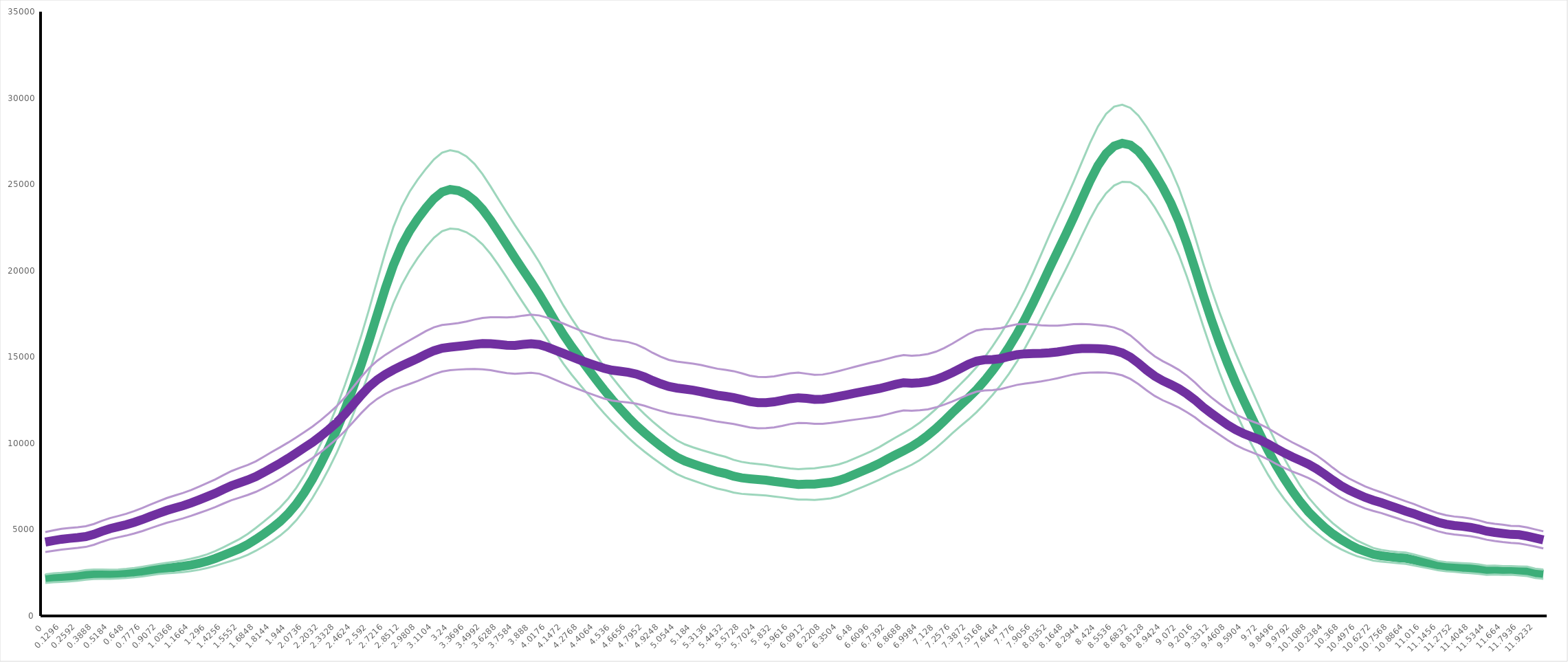
| Category | Series 0 | Series 2 | Series 3 | Series 4 | Series 6 | Series 7 |
|---|---|---|---|---|---|---|
| 0.0 | 2163.049 | 2411.605 | 1914.492 | 4280.385 | 4854.576 | 3706.194 |
| 0.0648 | 2210.368 | 2466.346 | 1954.389 | 4366.915 | 4958.204 | 3775.625 |
| 0.1296 | 2234.964 | 2495.438 | 1974.489 | 4442.118 | 5044.809 | 3839.427 |
| 0.1944 | 2271.876 | 2540.512 | 2003.239 | 4495.712 | 5099.495 | 3891.93 |
| 0.2592 | 2311.555 | 2583.061 | 2040.049 | 4538.245 | 5138.885 | 3937.605 |
| 0.324 | 2380.615 | 2657.579 | 2103.651 | 4596.774 | 5195.303 | 3998.246 |
| 0.3888 | 2412.805 | 2686.272 | 2139.338 | 4725.043 | 5326.624 | 4123.462 |
| 0.4536 | 2416.165 | 2683.911 | 2148.419 | 4899.577 | 5507.258 | 4291.895 |
| 0.5184 | 2414.963 | 2675.928 | 2153.998 | 5055.484 | 5667.34 | 4443.628 |
| 0.5832 | 2433.409 | 2691.871 | 2174.948 | 5172.232 | 5790.133 | 4554.331 |
| 0.648 | 2462.988 | 2724.174 | 2201.802 | 5286.346 | 5917.361 | 4655.332 |
| 0.7128 | 2507.661 | 2776.061 | 2239.261 | 5427.194 | 6077.427 | 4776.961 |
| 0.7776 | 2570.959 | 2848.75 | 2293.169 | 5586.823 | 6255.597 | 4918.049 |
| 0.8424 | 2647.4 | 2931.993 | 2362.808 | 5767.642 | 6451.744 | 5083.54 |
| 0.9072 | 2716.969 | 3008.909 | 2425.029 | 5941.809 | 6641.662 | 5241.957 |
| 0.972 | 2768.302 | 3072.198 | 2464.406 | 6110.945 | 6828.538 | 5393.351 |
| 1.0368 | 2816.168 | 3136.855 | 2495.481 | 6249.301 | 6979.667 | 5518.934 |
| 1.1016 | 2879.341 | 3220.059 | 2538.623 | 6385.121 | 7122.888 | 5647.353 |
| 1.1664 | 2953.573 | 3312.702 | 2594.444 | 6542.815 | 7289.434 | 5796.195 |
| 1.2312 | 3048.989 | 3424.675 | 2673.304 | 6725.379 | 7488.483 | 5962.274 |
| 1.296 | 3172.732 | 3570.345 | 2775.119 | 6912.484 | 7694.987 | 6129.982 |
| 1.3608 | 3330.127 | 3757.984 | 2902.27 | 7105.821 | 7907.648 | 6303.994 |
| 1.4256 | 3514.855 | 3980.293 | 3049.418 | 7333.957 | 8157.909 | 6510.006 |
| 1.4904 | 3704.852 | 4212.561 | 3197.144 | 7546.764 | 8391.935 | 6701.593 |
| 1.5552 | 3901.434 | 4456.089 | 3346.779 | 7714.232 | 8573.022 | 6855.442 |
| 1.62 | 4143.45 | 4749.929 | 3536.971 | 7877.915 | 8746.649 | 7009.181 |
| 1.6848 | 4434.763 | 5095.059 | 3774.466 | 8071.188 | 8955.317 | 7187.059 |
| 1.7496 | 4753.449 | 5466.676 | 4040.222 | 8317.658 | 9226.107 | 7409.209 |
| 1.8144 | 5092.135 | 5856.705 | 4327.564 | 8579.633 | 9503.217 | 7656.049 |
| 1.8792 | 5471.406 | 6288.078 | 4654.735 | 8846.768 | 9770.023 | 7923.512 |
| 1.944 | 5926.17 | 6801.175 | 5051.164 | 9132.853 | 10047.648 | 8218.058 |
| 2.0088 | 6480.809 | 7421.252 | 5540.366 | 9435 | 10342.249 | 8527.752 |
| 2.0736 | 7150.926 | 8164.86 | 6136.991 | 9747.214 | 10652.746 | 8841.683 |
| 2.1384 | 7926.611 | 9016.163 | 6837.06 | 10059.683 | 10970.944 | 9148.421 |
| 2.2032 | 8795.15 | 9957.531 | 7632.769 | 10410.261 | 11332.06 | 9488.463 |
| 2.268 | 9748.047 | 10985.188 | 8510.906 | 10794.433 | 11728.959 | 9859.908 |
| 2.3328 | 10791.009 | 12116.926 | 9465.091 | 11204.243 | 12155.226 | 10253.26 |
| 2.3976 | 11944.743 | 13374.591 | 10514.894 | 11687.595 | 12663.795 | 10711.394 |
| 2.4624 | 13199.251 | 14745.482 | 11653.021 | 12231.073 | 13240.494 | 11221.652 |
| 2.5272 | 14527.638 | 16202.603 | 12852.674 | 12784.109 | 13827.855 | 11740.363 |
| 2.592 | 15961.992 | 17782.621 | 14141.363 | 13283.963 | 14360.296 | 12207.63 |
| 2.6568 | 17475.713 | 19445.293 | 15506.133 | 13681.137 | 14785.823 | 12576.452 |
| 2.7216 | 18978.344 | 21084.338 | 16872.35 | 13992.622 | 15124.762 | 12860.481 |
| 2.7864 | 20333.958 | 22542.591 | 18125.326 | 14255.72 | 15420.201 | 13091.24 |
| 2.8512 | 21433.898 | 23697.661 | 19170.134 | 14487.46 | 15696.982 | 13277.938 |
| 2.916 | 22299.573 | 24577.721 | 20021.425 | 14703.159 | 15966.747 | 13439.571 |
| 2.9808 | 23005.946 | 25275.741 | 20736.151 | 14920.138 | 16231.165 | 13609.111 |
| 3.0456 | 23630.627 | 25893.906 | 21367.347 | 15153.188 | 16499.099 | 13807.277 |
| 3.1104 | 24175.618 | 26443.17 | 21908.067 | 15363.121 | 16721.673 | 14004.569 |
| 3.1752 | 24559.175 | 26832.738 | 22285.611 | 15503.928 | 16853.981 | 14153.876 |
| 3.24 | 24705.561 | 26972.116 | 22439.007 | 15567.962 | 16905.528 | 14230.397 |
| 3.3048 | 24638.962 | 26880.029 | 22397.895 | 15614.911 | 16960.094 | 14269.728 |
| 3.3696 | 24424.913 | 26622.241 | 22227.586 | 15671.065 | 17050.791 | 14291.339 |
| 3.4344 | 24061.801 | 26188.048 | 21935.555 | 15733.116 | 17166.156 | 14300.075 |
| 3.4992 | 23551.867 | 25587.892 | 21515.843 | 15774.425 | 17263.958 | 14284.893 |
| 3.564 | 22917.422 | 24871.787 | 20963.057 | 15767.692 | 17303.702 | 14231.683 |
| 3.6288 | 22207.336 | 24111.118 | 20303.554 | 15724.659 | 17301.692 | 14147.627 |
| 3.6936 | 21479.618 | 23365.607 | 19593.629 | 15680.408 | 17295.385 | 14065.432 |
| 3.7584 | 20745.283 | 22632.728 | 18857.839 | 15670.804 | 17319.19 | 14022.418 |
| 3.8232 | 20039.483 | 21935.798 | 18143.169 | 15725.04 | 17394.853 | 14055.226 |
| 3.888 | 19342.224 | 21235.842 | 17448.607 | 15766.592 | 17445.102 | 14088.083 |
| 3.9528 | 18624.875 | 20495.123 | 16754.628 | 15718.605 | 17405.955 | 14031.255 |
| 4.0176 | 17848.719 | 19668.633 | 16028.805 | 15574.947 | 17276.873 | 13873.022 |
| 4.0824 | 17045.588 | 18799.19 | 15291.986 | 15388.708 | 17106.987 | 13670.428 |
| 4.1472 | 16286.369 | 17972.103 | 14600.634 | 15203.655 | 16931.877 | 13475.433 |
| 4.212 | 15601.355 | 17225.576 | 13977.133 | 15010.499 | 16737.056 | 13283.942 |
| 4.2768 | 14970.561 | 16529.85 | 13411.273 | 14824.526 | 16547.976 | 13101.077 |
| 4.3416 | 14332.551 | 15820.143 | 12844.959 | 14659.542 | 16390.922 | 12928.163 |
| 4.4064 | 13701.338 | 15117.108 | 12285.567 | 14496.887 | 16238.762 | 12755.012 |
| 4.4712 | 13099.054 | 14449.641 | 11748.468 | 14343.703 | 16095.064 | 12592.341 |
| 4.536 | 12533.755 | 13825.822 | 11241.688 | 14232.963 | 15991.572 | 12474.353 |
| 4.6008 | 12007.089 | 13240.665 | 10773.512 | 14174.779 | 15937.024 | 12412.533 |
| 4.6656 | 11497.014 | 12674.19 | 10319.838 | 14112.124 | 15861.736 | 12362.513 |
| 4.7304 | 11029.007 | 12155.083 | 9902.931 | 14007.939 | 15725.344 | 12290.535 |
| 4.7952 | 10603.938 | 11690.185 | 9517.691 | 13841.484 | 15508.464 | 12174.503 |
| 4.86 | 10210.656 | 11265.542 | 9155.77 | 13631.819 | 15242.223 | 12021.415 |
| 4.9248 | 9844.019 | 10870.953 | 8817.085 | 13446.537 | 15013.738 | 11879.336 |
| 4.9896 | 9496.176 | 10495.55 | 8496.802 | 13295.126 | 14834.237 | 11756.015 |
| 5.0544 | 9195.205 | 10170.506 | 8219.904 | 13200.17 | 14731.504 | 11668.837 |
| 5.1192 | 8970.856 | 9934.22 | 8007.493 | 13138.281 | 14674.033 | 11602.529 |
| 5.184 | 8803.428 | 9764.166 | 7842.69 | 13072.795 | 14615.167 | 11530.424 |
| 5.2488 | 8646.407 | 9613.963 | 7678.851 | 12987.433 | 14529.862 | 11445.004 |
| 5.3136 | 8499.861 | 9476.778 | 7522.943 | 12885.075 | 14421.474 | 11348.676 |
| 5.3784 | 8356.433 | 9335.884 | 7376.982 | 12787.21 | 14320.072 | 11254.349 |
| 5.4432 | 8248.673 | 9218.43 | 7278.916 | 12719.989 | 14253.134 | 11186.845 |
| 5.508 | 8094.771 | 9044.225 | 7145.318 | 12649.26 | 14179.056 | 11119.464 |
| 5.5728 | 7998.02 | 8923.306 | 7072.735 | 12537.506 | 14054.641 | 11020.371 |
| 5.6376 | 7945.802 | 8853.921 | 7037.682 | 12418.985 | 13919.09 | 10918.88 |
| 5.7024 | 7901.874 | 8799.232 | 7004.516 | 12358.171 | 13845.106 | 10871.237 |
| 5.7672 | 7864.072 | 8751.285 | 6976.86 | 12355.406 | 13833.848 | 10876.965 |
| 5.832 | 7792.804 | 8670.142 | 6915.466 | 12400.534 | 13877.148 | 10923.921 |
| 5.8968 | 7733.064 | 8602.596 | 6863.531 | 12490.227 | 13967.428 | 11013.025 |
| 5.9616 | 7669.196 | 8539.549 | 6798.844 | 12584.114 | 14054.565 | 11113.662 |
| 6.0264 | 7620.285 | 8499.098 | 6741.472 | 12636.081 | 14090.586 | 11181.576 |
| 6.0912 | 7636.737 | 8533.166 | 6740.309 | 12598.726 | 14030.618 | 11166.834 |
| 6.156 | 7635.623 | 8551.293 | 6719.953 | 12546.293 | 13967.161 | 11125.425 |
| 6.2208 | 7691.724 | 8623.56 | 6759.888 | 12553.897 | 13981.108 | 11126.687 |
| 6.2856 | 7745.482 | 8681.356 | 6809.607 | 12624.408 | 14071.503 | 11177.314 |
| 6.3504 | 7850.002 | 8779.364 | 6920.639 | 12714.224 | 14186.882 | 11241.567 |
| 6.4152 | 8011.611 | 8933.53 | 7089.692 | 12808.251 | 14308.177 | 11308.325 |
| 6.48 | 8211.9 | 9133.989 | 7289.812 | 12903.484 | 14433.406 | 11373.562 |
| 6.5448 | 8408.151 | 9332.711 | 7483.591 | 12993.873 | 14554.761 | 11432.984 |
| 6.6096 | 8611.837 | 9542.393 | 7681.28 | 13082.623 | 14670.362 | 11494.884 |
| 6.6744 | 8833.17 | 9780.868 | 7885.472 | 13171.021 | 14772.077 | 11569.966 |
| 6.7392 | 9088.669 | 10058.857 | 8118.48 | 13289.945 | 14896.95 | 11682.941 |
| 6.804 | 9331.535 | 10330.043 | 8333.026 | 13414.018 | 15020.053 | 11807.983 |
| 6.8688 | 9568.069 | 10597.252 | 8538.885 | 13508.745 | 15112.443 | 11905.047 |
| 6.9336 | 9815.518 | 10872.728 | 8758.307 | 13477.893 | 15071.108 | 11884.678 |
| 6.9984 | 10114.295 | 11200.168 | 9028.422 | 13508.833 | 15102.985 | 11914.68 |
| 7.0632 | 10469.412 | 11577.95 | 9360.874 | 13570.134 | 15170.977 | 11969.291 |
| 7.128 | 10859.138 | 11988.205 | 9730.07 | 13695.36 | 15307.916 | 12082.804 |
| 7.1928 | 11295.802 | 12448.599 | 10143.005 | 13877.9 | 15516.113 | 12239.687 |
| 7.2576 | 11761.449 | 12945.639 | 10577.26 | 14091.965 | 15768.979 | 12414.952 |
| 7.3224 | 12201.176 | 13420.286 | 10982.066 | 14330.411 | 16048.025 | 12612.796 |
| 7.3872 | 12635.583 | 13893.001 | 11378.166 | 14573.609 | 16326.264 | 12820.953 |
| 7.452 | 13100.017 | 14399.995 | 11800.038 | 14761.85 | 16535.675 | 12988.026 |
| 7.5168 | 13630.869 | 14980.09 | 12281.648 | 14840.904 | 16617.777 | 13064.031 |
| 7.5816 | 14223.117 | 15633.127 | 12813.107 | 14854.457 | 16625.476 | 13083.438 |
| 7.6464 | 14862.946 | 16340.655 | 13385.236 | 14907.945 | 16674.831 | 13141.058 |
| 7.7112 | 15567.95 | 17113.03 | 14022.87 | 15028.666 | 16793.659 | 13263.672 |
| 7.776 | 16343.665 | 17951.293 | 14736.036 | 15136.477 | 16888.622 | 13384.332 |
| 7.8408 | 17204.536 | 18879.916 | 15529.156 | 15184.274 | 16907.721 | 13460.828 |
| 7.9056 | 18137.284 | 19889.247 | 16385.321 | 15198.815 | 16879.128 | 13518.502 |
| 7.9704 | 19123.001 | 20958.484 | 17287.519 | 15210.652 | 16835.447 | 13585.856 |
| 8.0352 | 20125.917 | 22042.409 | 18209.424 | 15240.739 | 16809.667 | 13671.811 |
| 8.1 | 21103.701 | 23083.102 | 19124.3 | 15292.794 | 16816.252 | 13769.337 |
| 8.1648 | 22077.511 | 24107.175 | 20047.846 | 15367.593 | 16853.897 | 13881.29 |
| 8.2296 | 23080.755 | 25161.391 | 21000.119 | 15444.148 | 16898.093 | 13990.204 |
| 8.2944 | 24131.603 | 26272.333 | 21990.873 | 15492.112 | 16915.118 | 14069.106 |
| 8.3592 | 25170.551 | 27378.425 | 22962.678 | 15494.006 | 16888.214 | 14099.798 |
| 8.424 | 26084.969 | 28351.587 | 23818.351 | 15476.429 | 16846.272 | 14106.587 |
| 8.4888 | 26780.012 | 29078.204 | 24481.82 | 15450.99 | 16802.634 | 14099.347 |
| 8.5536 | 27215.696 | 29500.518 | 24930.874 | 15379.648 | 16710.521 | 14048.776 |
| 8.6184 | 27377.891 | 29608.92 | 25146.862 | 15237.182 | 16539.367 | 13934.998 |
| 8.6832 | 27276.467 | 29428.029 | 25124.905 | 14989.862 | 16250.514 | 13729.21 |
| 8.748 | 26915.406 | 28979.049 | 24851.763 | 14641.432 | 15852.311 | 13430.552 |
| 8.8128 | 26340.655 | 28331.524 | 24349.787 | 14243.069 | 15414.003 | 13072.135 |
| 8.8776 | 25623.616 | 27572.416 | 23674.815 | 13894.088 | 15041.286 | 12746.891 |
| 8.9424 | 24825.208 | 26767.86 | 22882.557 | 13625.354 | 14758.215 | 12492.493 |
| 9.0072 | 23918.504 | 25865.579 | 21971.429 | 13406.125 | 14519.728 | 12292.522 |
| 9.072 | 22839.182 | 24778.066 | 20900.299 | 13160.472 | 14249.861 | 12071.082 |
| 9.1368 | 21539.584 | 23445.369 | 19633.799 | 12854.226 | 13912.332 | 11796.119 |
| 9.2016 | 20083.715 | 21938.434 | 18228.996 | 12505.202 | 13513.465 | 11496.939 |
| 9.2664 | 18581.97 | 20383.718 | 16780.222 | 12091.511 | 13051.472 | 11131.55 |
| 9.3312 | 17163.095 | 18930.295 | 15395.895 | 11737.724 | 12654.3 | 10821.147 |
| 9.396 | 15842.26 | 17590.876 | 14093.644 | 11398.454 | 12295.375 | 10501.534 |
| 9.4608 | 14629.552 | 16363.279 | 12895.825 | 11070.223 | 11959.914 | 10180.532 |
| 9.5256 | 13512.605 | 15217.547 | 11807.664 | 10789.051 | 11677.58 | 9900.522 |
| 9.5904 | 12477.799 | 14134.083 | 10821.516 | 10558.785 | 11449.703 | 9667.866 |
| 9.6552 | 11492.305 | 13081.204 | 9903.405 | 10380.576 | 11279.274 | 9481.878 |
| 9.72 | 10525.629 | 12030.024 | 9021.234 | 10201.247 | 11106.536 | 9295.958 |
| 9.7848 | 9592.67 | 10998.839 | 8186.502 | 9969.279 | 10871.282 | 9067.276 |
| 9.8496 | 8730.1 | 10026.301 | 7433.898 | 9700.795 | 10590.765 | 8810.825 |
| 9.9144 | 7955.088 | 9130.859 | 6779.318 | 9443.317 | 10312.346 | 8574.288 |
| 9.9792 | 7247.411 | 8295.849 | 6198.973 | 9212.177 | 10053.658 | 8370.695 |
| 10.044 | 6599.777 | 7528.768 | 5670.786 | 9004.094 | 9819.768 | 8188.421 |
| 10.1088 | 6032.282 | 6864.472 | 5200.092 | 8786.501 | 9584.779 | 7988.224 |
| 10.1736 | 5560.995 | 6316.566 | 4805.424 | 8520.506 | 9301.508 | 7739.505 |
| 10.2384 | 5123.615 | 5810.679 | 4436.551 | 8203.504 | 8957.298 | 7449.71 |
| 10.3032 | 4748.802 | 5370.159 | 4127.446 | 7867.352 | 8588.193 | 7146.511 |
| 10.368 | 4431.718 | 4996.176 | 3867.26 | 7548.102 | 8238.684 | 6857.519 |
| 10.4328 | 4154.094 | 4661.514 | 3646.675 | 7289.942 | 7962.318 | 6617.567 |
| 10.4976 | 3908.862 | 4361.341 | 3456.384 | 7075.039 | 7731.937 | 6418.141 |
| 10.5624 | 3740.47 | 4145.823 | 3335.117 | 6865.453 | 7503.242 | 6227.663 |
| 10.6272 | 3570.727 | 3936.325 | 3205.129 | 6701.203 | 7318.414 | 6083.991 |
| 10.692 | 3485.192 | 3824.311 | 3146.073 | 6558.28 | 7158.675 | 5957.884 |
| 10.7568 | 3429.428 | 3757.928 | 3100.927 | 6393.757 | 6984.962 | 5802.552 |
| 10.8216 | 3377.578 | 3702.239 | 3052.917 | 6233.677 | 6814.82 | 5652.533 |
| 10.8864 | 3343.83 | 3669.452 | 3018.208 | 6066.57 | 6641.538 | 5491.602 |
| 10.9512 | 3245.274 | 3561.696 | 2928.853 | 5926.795 | 6484.771 | 5368.82 |
| 11.016 | 3133.601 | 3434.675 | 2832.527 | 5749.973 | 6294.096 | 5205.85 |
| 11.0808 | 3028.105 | 3312.61 | 2743.601 | 5588.293 | 6118.087 | 5058.499 |
| 11.1456 | 2912.007 | 3180.24 | 2643.774 | 5426.632 | 5949.884 | 4903.381 |
| 11.2104 | 2851.813 | 3115.853 | 2587.773 | 5311.139 | 5831.963 | 4790.316 |
| 11.2752 | 2821.512 | 3089.593 | 2553.432 | 5238.947 | 5758.587 | 4719.307 |
| 11.34 | 2784.274 | 3057.829 | 2510.719 | 5191.054 | 5711.749 | 4670.36 |
| 11.4048 | 2755.724 | 3032.248 | 2479.201 | 5128.709 | 5641.534 | 4615.884 |
| 11.4696 | 2708.642 | 2982.012 | 2435.271 | 5033.633 | 5541.38 | 4525.887 |
| 11.5344 | 2642.304 | 2905.024 | 2379.585 | 4910.469 | 5406.284 | 4414.655 |
| 11.5992 | 2656.559 | 2916.044 | 2397.074 | 4836.961 | 5334.731 | 4339.192 |
| 11.664 | 2634.308 | 2886.062 | 2382.555 | 4779.871 | 5283.598 | 4276.143 |
| 11.7288 | 2636.679 | 2888.594 | 2384.764 | 4724.051 | 5220.642 | 4227.46 |
| 11.7936 | 2611.353 | 2870.604 | 2352.102 | 4706.084 | 5209.462 | 4202.707 |
| 11.8584 | 2580.674 | 2853.673 | 2307.676 | 4620.299 | 5123.473 | 4117.126 |
| 11.9232 | 2468.828 | 2739.744 | 2197.912 | 4516.782 | 5013.137 | 4020.427 |
| 11.988 | 2421.038 | 2689.372 | 2152.704 | 4407.232 | 4902.302 | 3912.162 |